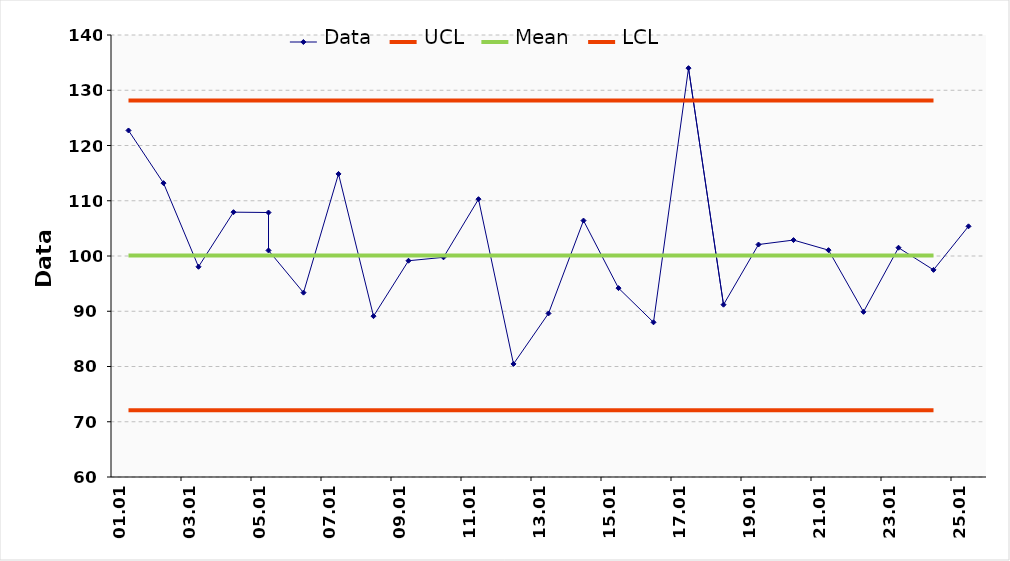
| Category | Data | UCL | Mean | LCL |
|---|---|---|---|---|
| 2009-01-01 | 122.719 |  |  |  |
| 2009-01-02 | 113.189 |  |  |  |
| 2009-01-03 | 98.052 |  |  |  |
| 2009-01-04 | 107.934 |  |  |  |
| 2009-01-05 | 107.872 |  |  |  |
| 2009-01-05 | 101 |  |  |  |
| 2009-01-06 | 93.368 |  |  |  |
| 2009-01-07 | 114.853 |  |  |  |
| 2009-01-08 | 89.11 |  |  |  |
| 2009-01-09 | 99.142 |  |  |  |
| 2009-01-10 | 99.758 |  |  |  |
| 2009-01-11 | 110.285 |  |  |  |
| 2009-01-12 | 80.466 |  |  |  |
| 2009-01-13 | 89.603 |  |  |  |
| 2009-01-14 | 106.415 |  |  |  |
| 2009-01-15 | 94.188 |  |  |  |
| 2009-01-16 | 87.998 |  |  |  |
| 2009-01-17 | 134 |  |  |  |
| 2009-01-18 | 91.184 |  |  |  |
| 2009-01-19 | 102.078 |  |  |  |
| 2009-01-20 | 102.883 |  |  |  |
| 2009-01-21 | 101.06 |  |  |  |
| 2009-01-22 | 89.891 |  |  |  |
| 2009-01-23 | 101.498 |  |  |  |
| 2009-01-24 | 97.486 |  |  |  |
| 2009-01-25 | 105.372 |  |  |  |